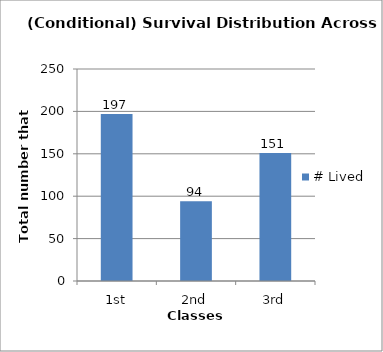
| Category | # Lived |
|---|---|
| 1st | 197 |
| 2nd | 94 |
| 3rd | 151 |